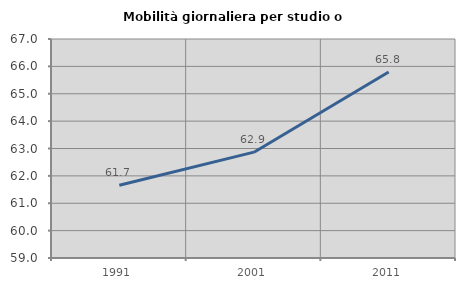
| Category | Mobilità giornaliera per studio o lavoro |
|---|---|
| 1991.0 | 61.657 |
| 2001.0 | 62.866 |
| 2011.0 | 65.795 |